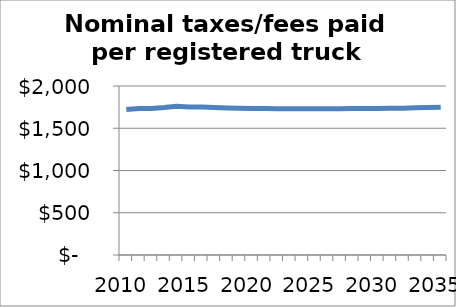
| Category | Series 0 |
|---|---|
| 2010.0 | 1722.407 |
| 2011.0 | 1733.723 |
| 2012.0 | 1732.729 |
| 2013.0 | 1744.741 |
| 2014.0 | 1760.967 |
| 2015.0 | 1752.042 |
| 2016.0 | 1750.584 |
| 2017.0 | 1745.936 |
| 2018.0 | 1740.903 |
| 2019.0 | 1737.531 |
| 2020.0 | 1734.66 |
| 2021.0 | 1732.314 |
| 2022.0 | 1730.701 |
| 2023.0 | 1729.934 |
| 2024.0 | 1729.864 |
| 2025.0 | 1730.237 |
| 2026.0 | 1730.812 |
| 2027.0 | 1731.547 |
| 2028.0 | 1732.466 |
| 2029.0 | 1733.499 |
| 2030.0 | 1734.848 |
| 2031.0 | 1736.384 |
| 2032.0 | 1738.097 |
| 2033.0 | 1741.153 |
| 2034.0 | 1744.504 |
| 2035.0 | 1748.098 |